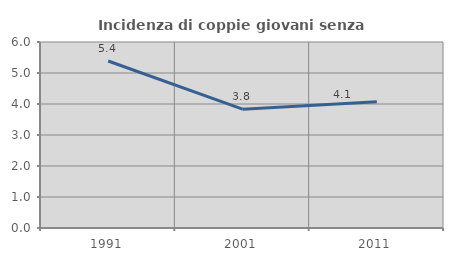
| Category | Incidenza di coppie giovani senza figli |
|---|---|
| 1991.0 | 5.387 |
| 2001.0 | 3.834 |
| 2011.0 | 4.072 |